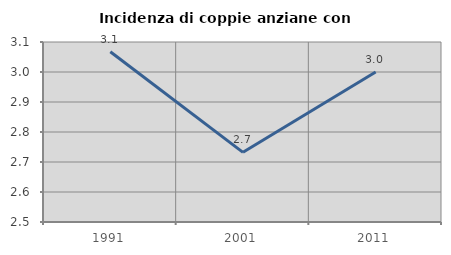
| Category | Incidenza di coppie anziane con figli |
|---|---|
| 1991.0 | 3.067 |
| 2001.0 | 2.732 |
| 2011.0 | 3 |